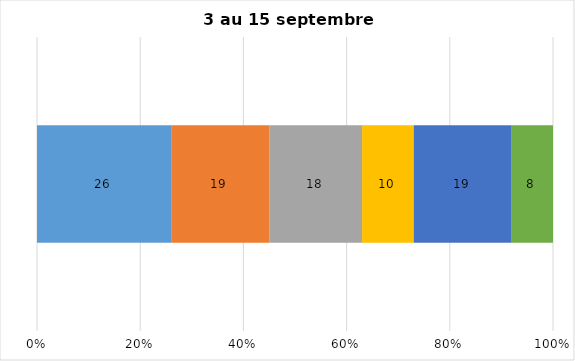
| Category | Plusieurs fois par jour | Une fois par jour | Quelques fois par semaine   | Une fois par semaine ou moins   |  Jamais   |  Je n’utilise pas les médias sociaux |
|---|---|---|---|---|---|---|
| 0 | 26 | 19 | 18 | 10 | 19 | 8 |